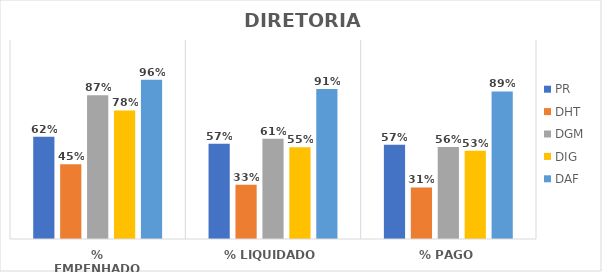
| Category | PR | DHT | DGM | DIG | DAF |
|---|---|---|---|---|---|
| % EMPENHADO | 0.617 | 0.451 | 0.867 | 0.775 | 0.96 |
| % LIQUIDADO | 0.574 | 0.327 | 0.605 | 0.553 | 0.905 |
| % PAGO | 0.568 | 0.311 | 0.555 | 0.532 | 0.89 |